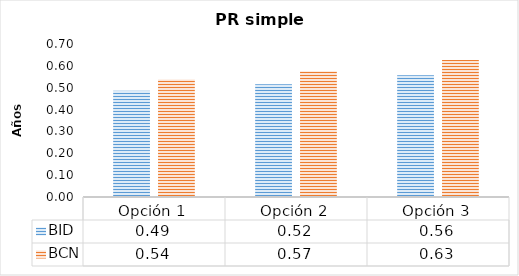
| Category | BID | BCN |
|---|---|---|
| Opción 1 | 0.486 | 0.538 |
| Opción 2 | 0.516 | 0.575 |
| Opción 3 | 0.558 | 0.627 |